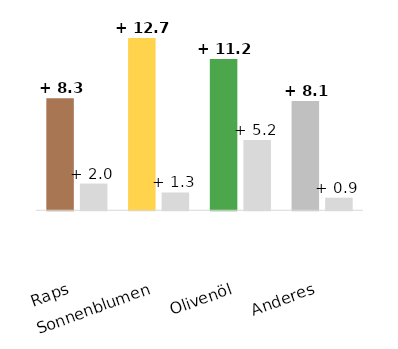
| Category | in % |
|---|---|
| Raps | 1.97 |
| Sonnenblumen | 1.311 |
| Olivenöl | 5.177 |
| Anderes | 0.929 |